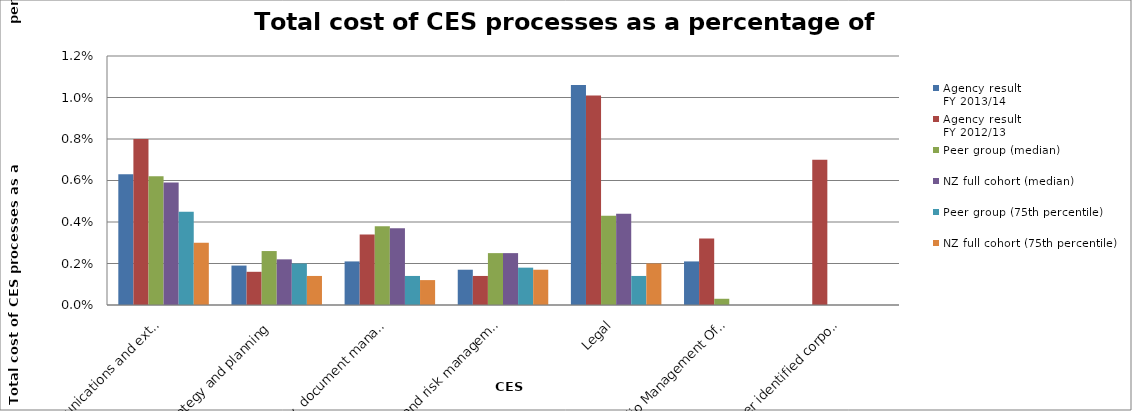
| Category | Agency result
FY 2013/14 | Agency result
FY 2012/13 | Peer group (median) | NZ full cohort (median) | Peer group (75th percentile) | NZ full cohort (75th percentile) |
|---|---|---|---|---|---|---|
| Communications and external relations (excluding the publications function) | 0.006 | 0.008 | 0.006 | 0.006 | 0.004 | 0.003 |
| Strategy and planning | 0.002 | 0.002 | 0.003 | 0.002 | 0.002 | 0.001 |
| Library, document management, archive and research | 0.002 | 0.003 | 0.004 | 0.004 | 0.001 | 0.001 |
| Audit and risk management | 0.002 | 0.001 | 0.002 | 0.002 | 0.002 | 0.002 |
| Legal | 0.011 | 0.01 | 0.004 | 0.004 | 0.001 | 0.002 |
| Portfolio Management Office | 0.002 | 0.003 | 0 | 0 | 0 | 0 |
| All other identified corporate costs | 0 | 0.007 | 0 | 0 | 0 | 0 |